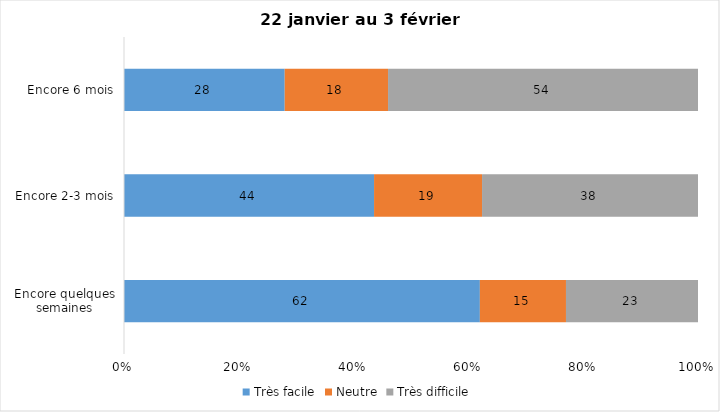
| Category | Très facile | Neutre | Très difficile |
|---|---|---|---|
| Encore quelques semaines | 62 | 15 | 23 |
| Encore 2-3 mois | 44 | 19 | 38 |
| Encore 6 mois | 28 | 18 | 54 |